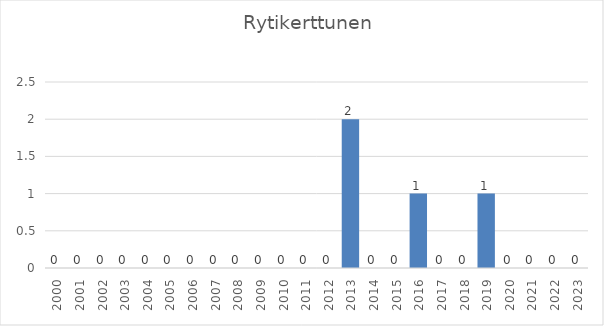
| Category | Series 0 |
|---|---|
| 2000.0 | 0 |
| 2001.0 | 0 |
| 2002.0 | 0 |
| 2003.0 | 0 |
| 2004.0 | 0 |
| 2005.0 | 0 |
| 2006.0 | 0 |
| 2007.0 | 0 |
| 2008.0 | 0 |
| 2009.0 | 0 |
| 2010.0 | 0 |
| 2011.0 | 0 |
| 2012.0 | 0 |
| 2013.0 | 2 |
| 2014.0 | 0 |
| 2015.0 | 0 |
| 2016.0 | 1 |
| 2017.0 | 0 |
| 2018.0 | 0 |
| 2019.0 | 1 |
| 2020.0 | 0 |
| 2021.0 | 0 |
| 2022.0 | 0 |
| 2023.0 | 0 |